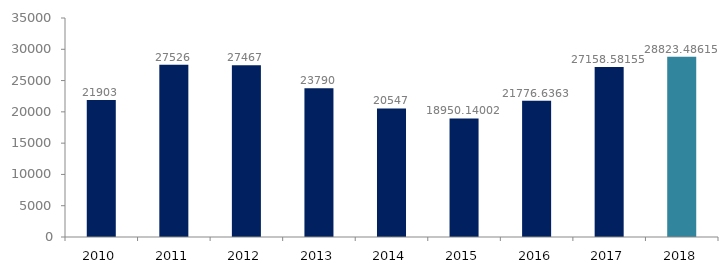
| Category | Series 1 |
|---|---|
| 2010.0 | 21903 |
| 2011.0 | 27526 |
| 2012.0 | 27467 |
| 2013.0 | 23790 |
| 2014.0 | 20547 |
| 2015.0 | 18950.14 |
| 2016.0 | 21776.636 |
| 2017.0 | 27158.582 |
| 2018.0 | 28823.486 |